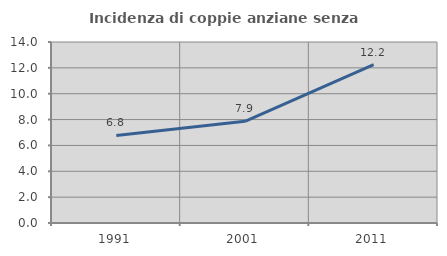
| Category | Incidenza di coppie anziane senza figli  |
|---|---|
| 1991.0 | 6.771 |
| 2001.0 | 7.868 |
| 2011.0 | 12.244 |